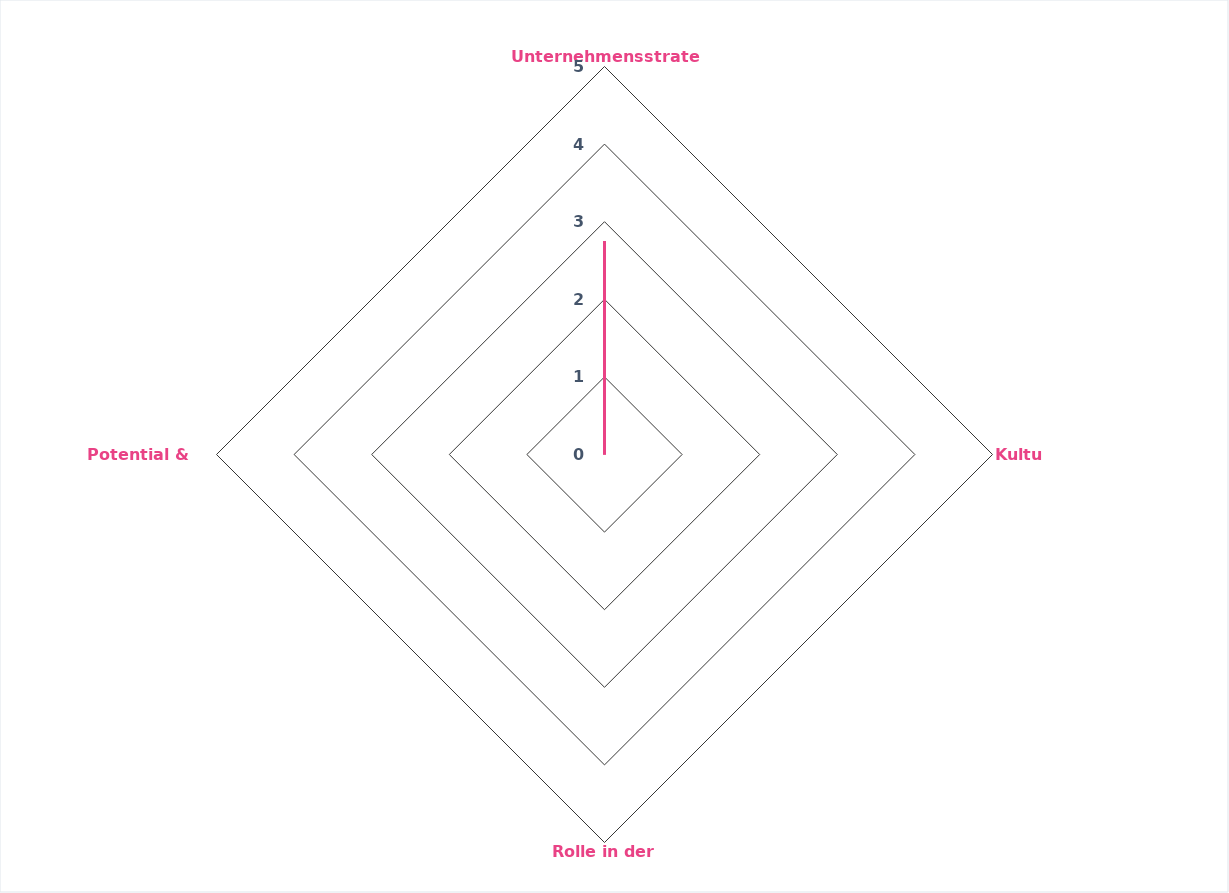
| Category | Series 0 | Series 1 |
|---|---|---|
| Unternehmensstrategie |  | 2.75 |
| Kultur |  | 0 |
| Rolle in der Region |  | 0 |
| Potential & Wissen |  | 0 |